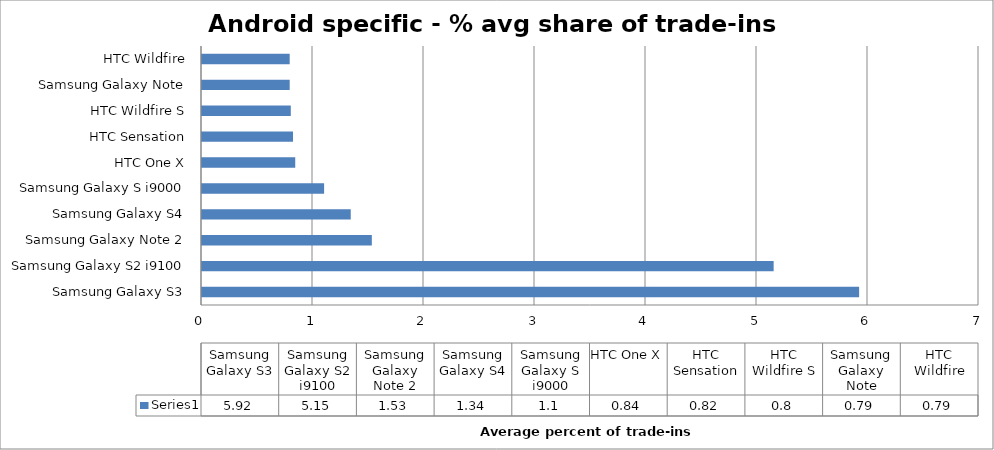
| Category | Series 0 |
|---|---|
| Samsung Galaxy S3 | 5.92 |
| Samsung Galaxy S2 i9100 | 5.15 |
| Samsung Galaxy Note 2 | 1.53 |
| Samsung Galaxy S4 | 1.34 |
| Samsung Galaxy S i9000 | 1.1 |
| HTC One X | 0.84 |
| HTC Sensation | 0.82 |
| HTC Wildfire S | 0.8 |
| Samsung Galaxy Note | 0.79 |
| HTC Wildfire | 0.79 |